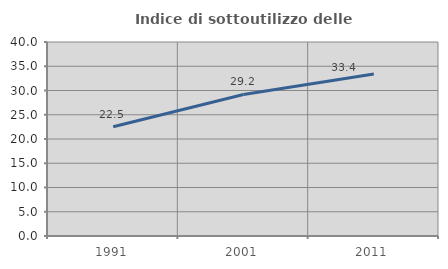
| Category | Indice di sottoutilizzo delle abitazioni  |
|---|---|
| 1991.0 | 22.518 |
| 2001.0 | 29.181 |
| 2011.0 | 33.384 |